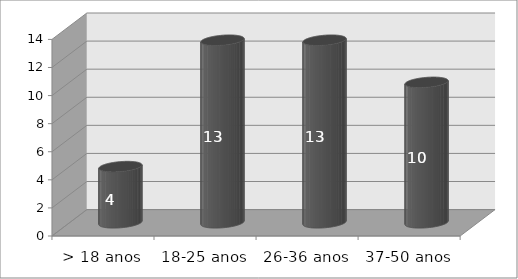
| Category | Series 0 |
|---|---|
| > 18 anos | 4 |
| 18-25 anos | 13 |
| 26-36 anos | 13 |
| 37-50 anos | 10 |